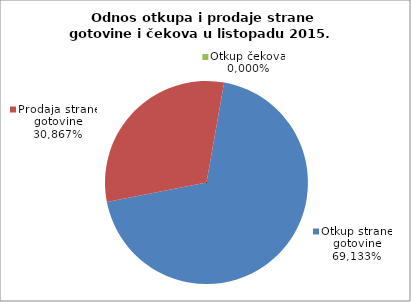
| Category | Otkup strane gotovine |
|---|---|
| 0 | 0.691 |
| 1 | 0.309 |
| 2 | 0 |